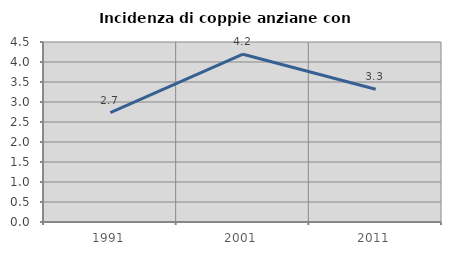
| Category | Incidenza di coppie anziane con figli |
|---|---|
| 1991.0 | 2.734 |
| 2001.0 | 4.195 |
| 2011.0 | 3.32 |